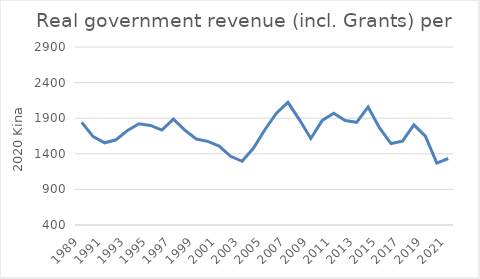
| Category | Real government revenue per capita |
|---|---|
| 1989.0 | 1842.109 |
| 1990.0 | 1640.271 |
| 1991.0 | 1554.348 |
| 1992.0 | 1596.916 |
| 1993.0 | 1728.537 |
| 1994.0 | 1821.312 |
| 1995.0 | 1798.568 |
| 1996.0 | 1733.456 |
| 1997.0 | 1887.909 |
| 1998.0 | 1733.101 |
| 1999.0 | 1607.72 |
| 2000.0 | 1574.835 |
| 2001.0 | 1509.395 |
| 2002.0 | 1364.879 |
| 2003.0 | 1294.948 |
| 2004.0 | 1479.969 |
| 2005.0 | 1741.466 |
| 2006.0 | 1969.56 |
| 2007.0 | 2121.908 |
| 2008.0 | 1880.934 |
| 2009.0 | 1615.317 |
| 2010.0 | 1869.623 |
| 2011.0 | 1968.435 |
| 2012.0 | 1866.407 |
| 2013.0 | 1841.698 |
| 2014.0 | 2058.138 |
| 2015.0 | 1763.358 |
| 2016.0 | 1543.668 |
| 2017.0 | 1578.069 |
| 2018.0 | 1806.002 |
| 2019.0 | 1647.688 |
| 2020.0 | 1268.942 |
| 2021.0 | 1333.858 |